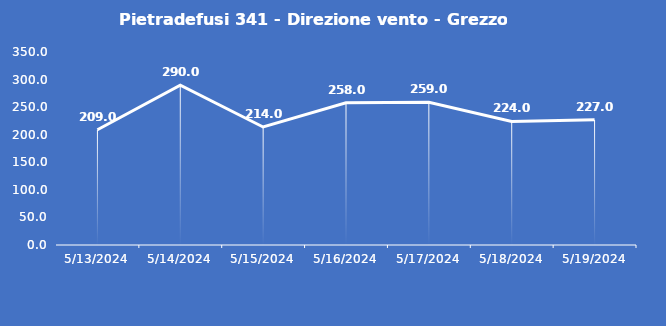
| Category | Pietradefusi 341 - Direzione vento - Grezzo (°N) |
|---|---|
| 5/13/24 | 209 |
| 5/14/24 | 290 |
| 5/15/24 | 214 |
| 5/16/24 | 258 |
| 5/17/24 | 259 |
| 5/18/24 | 224 |
| 5/19/24 | 227 |